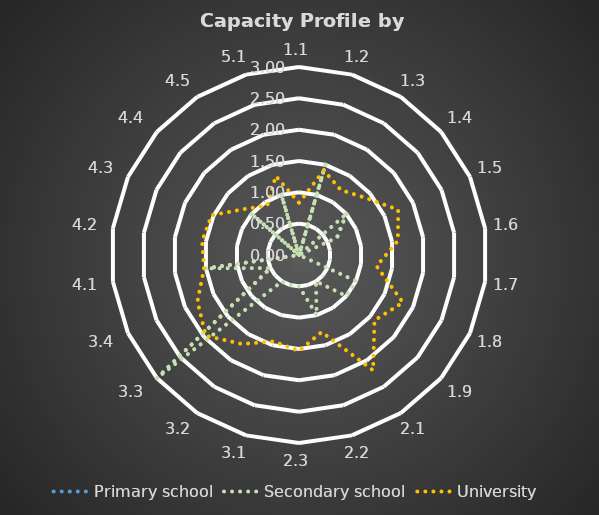
| Category | Primary school | Secondary school | University |
|---|---|---|---|
| 1.1 | 0 | 0 | 0.833 |
| 1.2 | 0 | 1.5 | 1.406 |
| 1.3 | 0 | 0 | 1.233 |
| 1.4 | 0 | 1 | 1.396 |
| 1.5 | 0 | 0.667 | 1.74 |
| 1.6 | 0 | 0 | 1.594 |
| 1.7 | 0 | 0 | 1.25 |
| 1.8 | 0 | 1 | 1.823 |
| 1.9 | 0 | 1 | 1.594 |
| 2.1 | 0 | 0.5 | 2.188 |
| 2.2 | 0 | 1 | 1.281 |
| 2.3 | 0 | 0.5 | 1.531 |
| 3.1 | 0 | 0.5 | 1.438 |
| 3.2 | 0 | 0.5 | 1.688 |
| 3.3 | 0 | 3 | 1.969 |
| 3.4 | 0 | 0.5 | 1.781 |
| 4.1 | 0 | 1.5 | 1.531 |
| 4.2 | 0 | 0 | 1.562 |
| 4.3 | 0 | 0 | 1.531 |
| 4.4 | 0 | 1 | 1.125 |
| 4.5 | 0 | 0 | 0.938 |
| 5.1 | 0 | 1 | 1.312 |